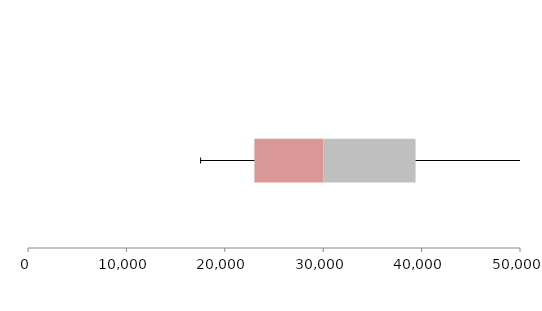
| Category | Series 1 | Series 2 | Series 3 |
|---|---|---|---|
| 0 | 23007.448 | 6994.79 | 9384.146 |